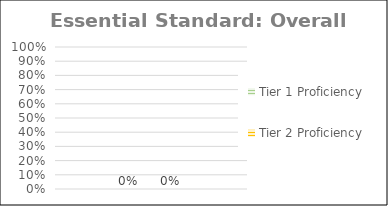
| Category | Tier 1 Proficiency | Tier 2 Proficiency |
|---|---|---|
| Total Class | 0 | 0 |